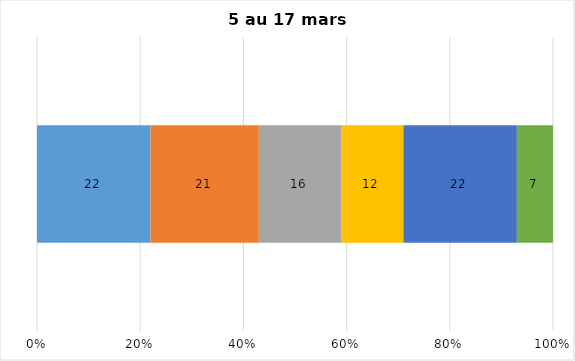
| Category | Plusieurs fois par jour | Une fois par jour | Quelques fois par semaine   | Une fois par semaine ou moins   |  Jamais   |  Je n’utilise pas les médias sociaux |
|---|---|---|---|---|---|---|
| 0 | 22 | 21 | 16 | 12 | 22 | 7 |